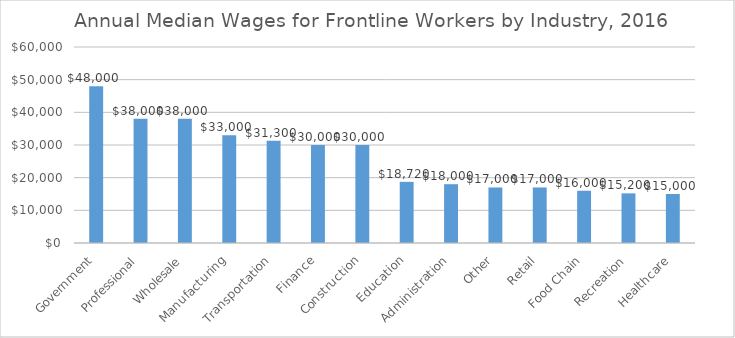
| Category | Series 0 |
|---|---|
| Government | 48000 |
| Professional | 38000 |
| Wholesale | 38000 |
| Manufacturing | 33000 |
| Transportation | 31300 |
| Finance | 30000 |
| Construction | 30000 |
| Education | 18720 |
| Administration | 18000 |
| Other | 17000 |
| Retail | 17000 |
| Food Chain | 16000 |
| Recreation | 15200 |
| Healthcare | 15000 |